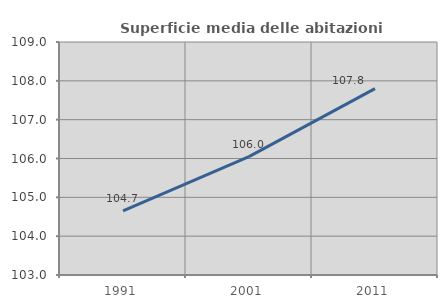
| Category | Superficie media delle abitazioni occupate |
|---|---|
| 1991.0 | 104.654 |
| 2001.0 | 106.047 |
| 2011.0 | 107.799 |